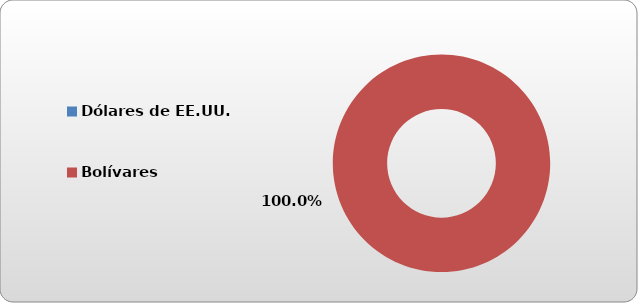
| Category | Dólares de EE.UU. |
|---|---|
| Dólares de EE.UU. | 0 |
| Bolívares | 435756.2 |